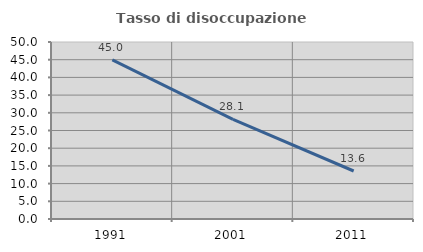
| Category | Tasso di disoccupazione giovanile  |
|---|---|
| 1991.0 | 44.966 |
| 2001.0 | 28.125 |
| 2011.0 | 13.559 |